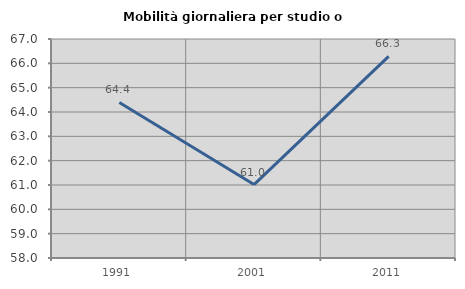
| Category | Mobilità giornaliera per studio o lavoro |
|---|---|
| 1991.0 | 64.393 |
| 2001.0 | 61.017 |
| 2011.0 | 66.289 |